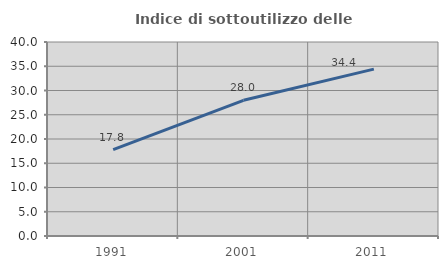
| Category | Indice di sottoutilizzo delle abitazioni  |
|---|---|
| 1991.0 | 17.798 |
| 2001.0 | 27.979 |
| 2011.0 | 34.402 |